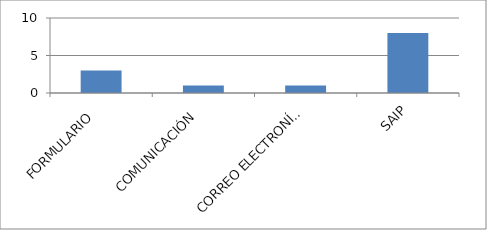
| Category | Series 0 |
|---|---|
| FORMULARIO  | 3 |
| COMUNICACIÓN  | 1 |
| CORREO ELECTRONÍCO  | 1 |
| SAIP | 8 |